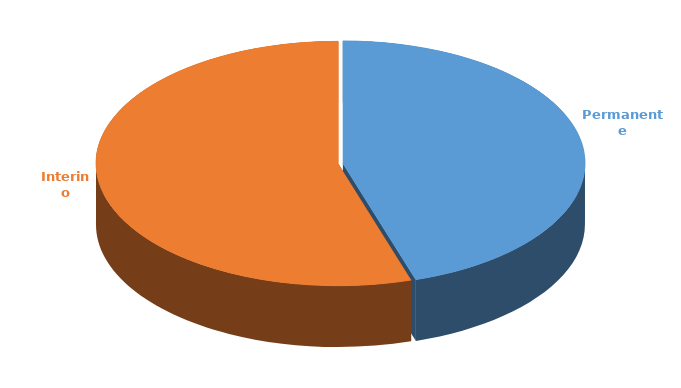
| Category | Cantidad |
|---|---|
| Permanente | 2781 |
| Interino | 3382 |